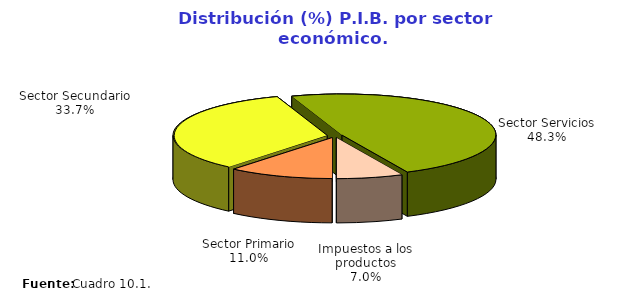
| Category | Series 0 |
|---|---|
| Sector Primario | 26647878.451 |
| Sector Secundario | 81398434.392 |
| Sector Servicios | 116598409.406 |
| Impuestos a los productos | 16882363.469 |